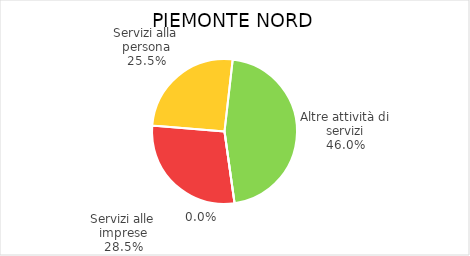
| Category | Piemonte Nord |
|---|---|
| Servizi alle imprese | 6756 |
| Servizi alla persona | 6033 |
| Altre attività di servizi | 10880 |